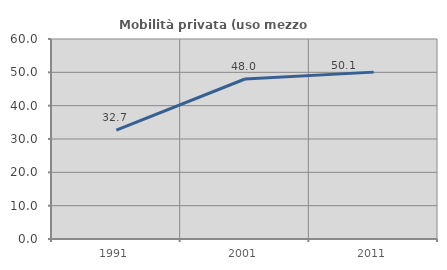
| Category | Mobilità privata (uso mezzo privato) |
|---|---|
| 1991.0 | 32.665 |
| 2001.0 | 47.995 |
| 2011.0 | 50.062 |